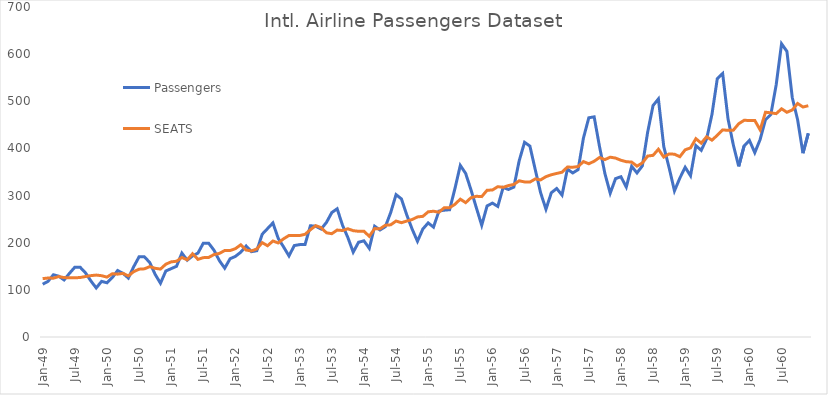
| Category | Passengers | SEATS |
|---|---|---|
| 1949-01-01 | 112 | 123.822 |
| 1949-02-01 | 118 | 125.143 |
| 1949-03-01 | 132 | 124.762 |
| 1949-04-01 | 129 | 128.187 |
| 1949-05-01 | 121 | 125.986 |
| 1949-06-01 | 135 | 125.795 |
| 1949-07-01 | 148 | 125.508 |
| 1949-08-01 | 148 | 126.227 |
| 1949-09-01 | 136 | 128.262 |
| 1949-10-01 | 119 | 130.156 |
| 1949-11-01 | 104 | 131.341 |
| 1949-12-01 | 118 | 130.055 |
| 1950-01-01 | 115 | 127.043 |
| 1950-02-01 | 126 | 134.149 |
| 1950-03-01 | 141 | 133.328 |
| 1950-04-01 | 135 | 134.961 |
| 1950-05-01 | 125 | 129.66 |
| 1950-06-01 | 149 | 138.603 |
| 1950-07-01 | 170 | 143.849 |
| 1950-08-01 | 170 | 144.591 |
| 1950-09-01 | 158 | 149.286 |
| 1950-10-01 | 133 | 145.731 |
| 1950-11-01 | 114 | 144.089 |
| 1950-12-01 | 140 | 154.427 |
| 1951-01-01 | 145 | 159.36 |
| 1951-02-01 | 150 | 160.718 |
| 1951-03-01 | 178 | 168.631 |
| 1951-04-01 | 163 | 163.769 |
| 1951-05-01 | 172 | 176.595 |
| 1951-06-01 | 178 | 164.712 |
| 1951-07-01 | 199 | 168.339 |
| 1951-08-01 | 199 | 168.745 |
| 1951-09-01 | 184 | 174.893 |
| 1951-10-01 | 162 | 177.237 |
| 1951-11-01 | 146 | 183.475 |
| 1951-12-01 | 166 | 183.346 |
| 1952-01-01 | 171 | 187.393 |
| 1952-02-01 | 180 | 195.637 |
| 1952-03-01 | 193 | 184.475 |
| 1952-04-01 | 181 | 182.534 |
| 1952-05-01 | 183 | 186.823 |
| 1952-06-01 | 218 | 200.204 |
| 1952-07-01 | 230 | 193.577 |
| 1952-08-01 | 242 | 203.633 |
| 1952-09-01 | 209 | 199.487 |
| 1952-10-01 | 191 | 208.331 |
| 1952-11-01 | 172 | 215.343 |
| 1952-12-01 | 194 | 215.224 |
| 1953-01-01 | 196 | 215.194 |
| 1953-02-01 | 196 | 217.867 |
| 1953-03-01 | 236 | 227.491 |
| 1953-04-01 | 235 | 236.177 |
| 1953-05-01 | 229 | 232.042 |
| 1953-06-01 | 243 | 221.063 |
| 1953-07-01 | 264 | 219.114 |
| 1953-08-01 | 272 | 226.826 |
| 1953-09-01 | 237 | 225.849 |
| 1953-10-01 | 211 | 229.571 |
| 1953-11-01 | 180 | 225.555 |
| 1953-12-01 | 201 | 224.206 |
| 1954-01-01 | 204 | 224.391 |
| 1954-02-01 | 188 | 213.615 |
| 1954-03-01 | 235 | 229.943 |
| 1954-04-01 | 227 | 229.55 |
| 1954-05-01 | 234 | 237.032 |
| 1954-06-01 | 264 | 237.964 |
| 1954-07-01 | 302 | 245.97 |
| 1954-08-01 | 293 | 242.49 |
| 1954-09-01 | 259 | 245.938 |
| 1954-10-01 | 229 | 249.13 |
| 1954-11-01 | 203 | 254.733 |
| 1954-12-01 | 229 | 255.882 |
| 1955-01-01 | 242 | 265.527 |
| 1955-02-01 | 233 | 266.788 |
| 1955-03-01 | 267 | 264.682 |
| 1955-04-01 | 269 | 274.139 |
| 1955-05-01 | 270 | 274.366 |
| 1955-06-01 | 315 | 281.403 |
| 1955-07-01 | 364 | 292.441 |
| 1955-08-01 | 347 | 284.977 |
| 1955-09-01 | 312 | 295.449 |
| 1955-10-01 | 274 | 298.478 |
| 1955-11-01 | 237 | 297.809 |
| 1955-12-01 | 278 | 311.287 |
| 1956-01-01 | 284 | 311.808 |
| 1956-02-01 | 277 | 318.879 |
| 1956-03-01 | 317 | 317.53 |
| 1956-04-01 | 313 | 321.233 |
| 1956-05-01 | 318 | 323.613 |
| 1956-06-01 | 374 | 331.334 |
| 1956-07-01 | 413 | 328.97 |
| 1956-08-01 | 405 | 328.603 |
| 1956-09-01 | 355 | 335.321 |
| 1956-10-01 | 306 | 333.247 |
| 1956-11-01 | 271 | 340.166 |
| 1956-12-01 | 306 | 344.164 |
| 1957-01-01 | 315 | 346.95 |
| 1957-02-01 | 301 | 349.533 |
| 1957-03-01 | 356 | 360.509 |
| 1957-04-01 | 348 | 360.132 |
| 1957-05-01 | 355 | 361.486 |
| 1957-06-01 | 422 | 372.087 |
| 1957-07-01 | 465 | 367.463 |
| 1957-08-01 | 467 | 372.799 |
| 1957-09-01 | 404 | 380.764 |
| 1957-10-01 | 347 | 376.291 |
| 1957-11-01 | 305 | 381.444 |
| 1957-12-01 | 336 | 379.526 |
| 1958-01-01 | 340 | 374.898 |
| 1958-02-01 | 318 | 371.872 |
| 1958-03-01 | 362 | 371.023 |
| 1958-04-01 | 348 | 362.406 |
| 1958-05-01 | 363 | 369.221 |
| 1958-06-01 | 435 | 383.844 |
| 1958-07-01 | 491 | 385.303 |
| 1958-08-01 | 505 | 398.293 |
| 1958-09-01 | 404 | 381.623 |
| 1958-10-01 | 359 | 388.386 |
| 1958-11-01 | 310 | 387.74 |
| 1958-12-01 | 337 | 382.464 |
| 1959-01-01 | 360 | 397.066 |
| 1959-02-01 | 342 | 401.162 |
| 1959-03-01 | 406 | 420.685 |
| 1959-04-01 | 396 | 411.156 |
| 1959-05-01 | 420 | 424.725 |
| 1959-06-01 | 472 | 417.535 |
| 1959-07-01 | 548 | 427.927 |
| 1959-08-01 | 559 | 439.293 |
| 1959-09-01 | 463 | 438.356 |
| 1959-10-01 | 407 | 438.791 |
| 1959-11-01 | 362 | 452.421 |
| 1959-12-01 | 405 | 459.57 |
| 1960-01-01 | 417 | 459.432 |
| 1960-02-01 | 391 | 459.429 |
| 1960-03-01 | 419 | 439.354 |
| 1960-04-01 | 461 | 476.796 |
| 1960-05-01 | 472 | 475.547 |
| 1960-06-01 | 535 | 473.779 |
| 1960-07-01 | 622 | 484.055 |
| 1960-08-01 | 606 | 476.7 |
| 1960-09-01 | 508 | 481.54 |
| 1960-10-01 | 461 | 495.368 |
| 1960-11-01 | 390 | 487.78 |
| 1960-12-01 | 432 | 490.588 |